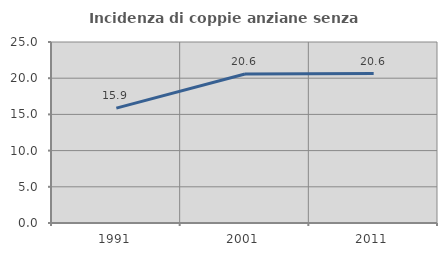
| Category | Incidenza di coppie anziane senza figli  |
|---|---|
| 1991.0 | 15.862 |
| 2001.0 | 20.588 |
| 2011.0 | 20.635 |